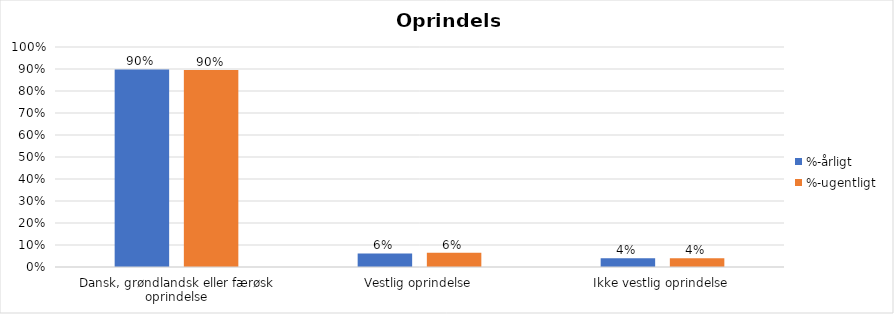
| Category | %-årligt | %-ugentligt |
|---|---|---|
| Dansk, grøndlandsk eller færøsk oprindelse | 0.898 | 0.896 |
| Vestlig oprindelse | 0.062 | 0.064 |
| Ikke vestlig oprindelse | 0.04 | 0.04 |